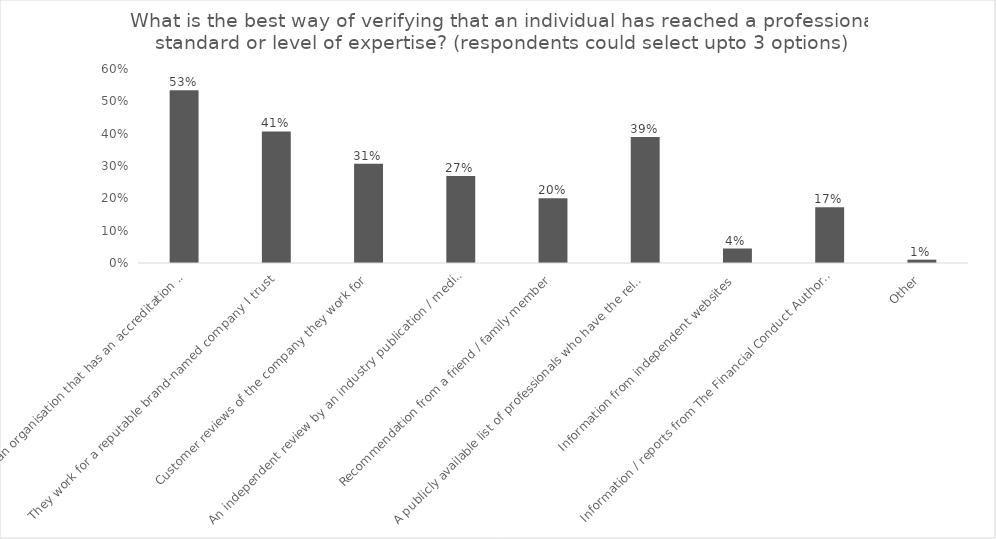
| Category | % of Respondents |
|---|---|
| They work for an organisation that has an accreditation or chartered status   | 0.534 |
| They work for a reputable brand-named company I trust | 0.407 |
| Customer reviews of the company they work for | 0.307 |
| An independent review by an industry publication / media outlet | 0.269 |
| Recommendation from a friend / family member | 0.2 |
| A publicly available list of professionals who have the relevant qualification | 0.39 |
| Information from independent websites  | 0.045 |
|  Information / reports from The Financial Conduct Authority (FCA) | 0.172 |
| Other | 0.01 |